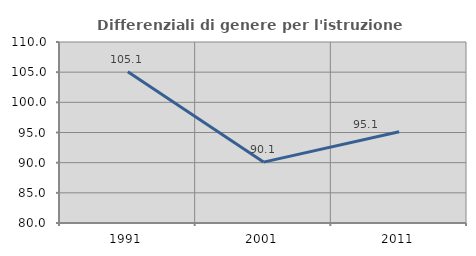
| Category | Differenziali di genere per l'istruzione superiore |
|---|---|
| 1991.0 | 105.072 |
| 2001.0 | 90.094 |
| 2011.0 | 95.111 |